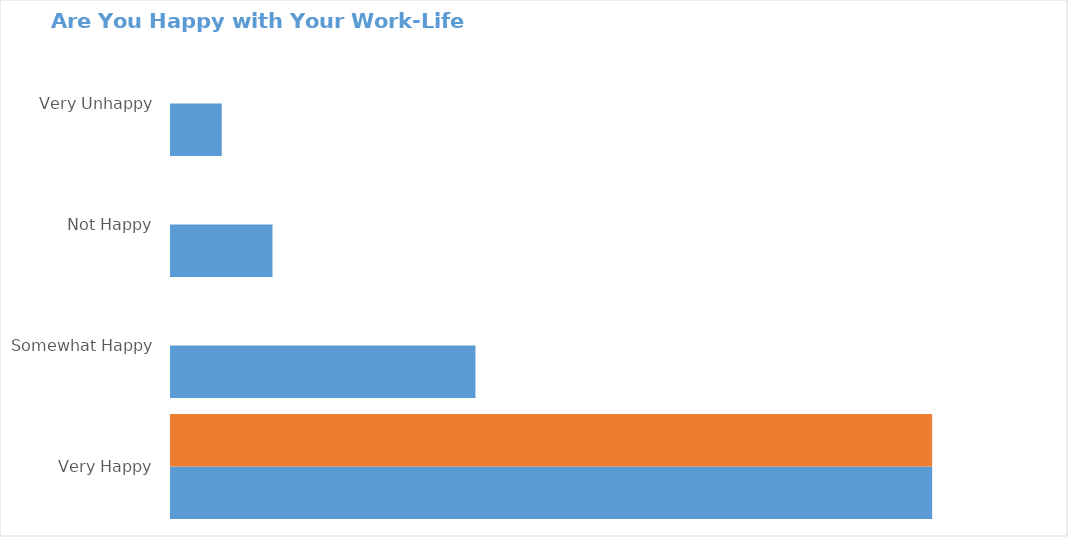
| Category | Series 0 | Series 1 |
|---|---|---|
| Very Happy | 300 | 300 |
| Somewhat Happy | 120 | 0 |
| Not Happy | 40 | 0 |
| Very Unhappy | 20 | 0 |